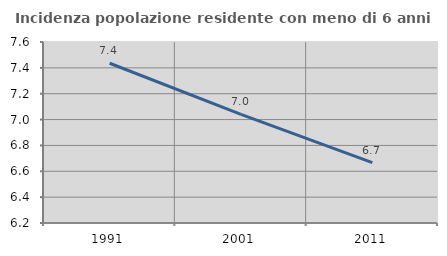
| Category | Incidenza popolazione residente con meno di 6 anni |
|---|---|
| 1991.0 | 7.436 |
| 2001.0 | 7.04 |
| 2011.0 | 6.666 |